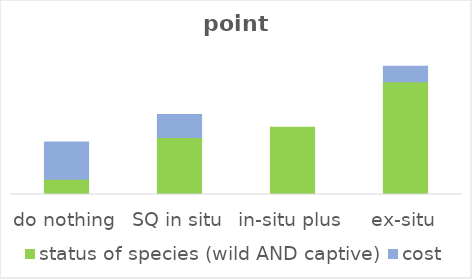
| Category | status of species (wild AND captive) | cost |
|---|---|---|
| do nothing | 0.082 | 0.2 |
| SQ in situ | 0.306 | 0.123 |
| in-situ plus | 0.36 | 0 |
| ex-situ | 0.605 | 0.084 |